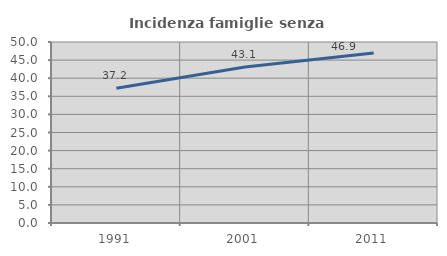
| Category | Incidenza famiglie senza nuclei |
|---|---|
| 1991.0 | 37.247 |
| 2001.0 | 43.066 |
| 2011.0 | 46.931 |